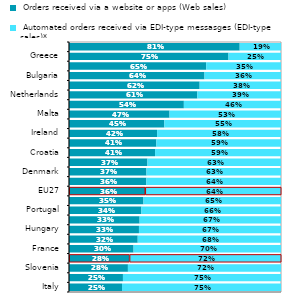
| Category |  Orders received via a website or apps (Web sales) |  Automated orders received via EDI-type messasges (EDI-type sales)* |
|---|---|---|
| Italy | 0.25 | 0.75 |
| Slovakia | 0.254 | 0.746 |
| Slovenia | 0.278 | 0.722 |
| Czechia | 0.285 | 0.715 |
| France | 0.305 | 0.695 |
| Austria | 0.324 | 0.676 |
| Hungary | 0.33 | 0.67 |
| Sweden | 0.333 | 0.667 |
| Portugal | 0.342 | 0.658 |
| Belgium | 0.351 | 0.649 |
| EU27 | 0.359 | 0.641 |
| Germany | 0.365 | 0.635 |
| Denmark | 0.365 | 0.635 |
| Poland | 0.37 | 0.63 |
| Croatia | 0.406 | 0.594 |
| Spain | 0.412 | 0.588 |
| Ireland | 0.416 | 0.584 |
| Estonia | 0.45 | 0.55 |
| Malta | 0.474 | 0.526 |
| Latvia | 0.542 | 0.458 |
| Netherlands | 0.605 | 0.395 |
| Romania | 0.616 | 0.384 |
| Bulgaria | 0.639 | 0.361 |
| Lithuania | 0.647 | 0.353 |
| Greece | 0.752 | 0.248 |
| Cyprus | 0.805 | 0.195 |